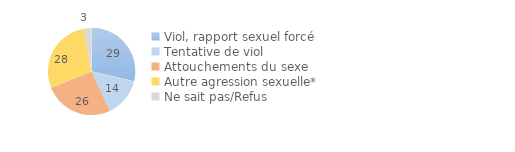
| Category | Series 0 |
|---|---|
| Viol, rapport sexuel forcé | 28.962 |
| Tentative de viol | 14.416 |
| Attouchements du sexe | 26.067 |
| Autre agression sexuelle* | 28.454 |
| Ne sait pas/Refus | 2.947 |